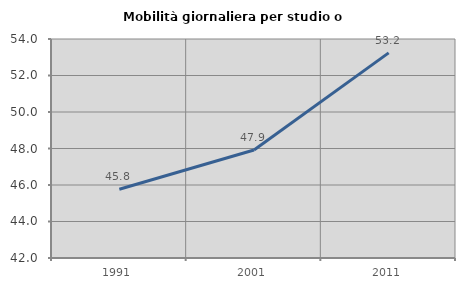
| Category | Mobilità giornaliera per studio o lavoro |
|---|---|
| 1991.0 | 45.765 |
| 2001.0 | 47.919 |
| 2011.0 | 53.24 |